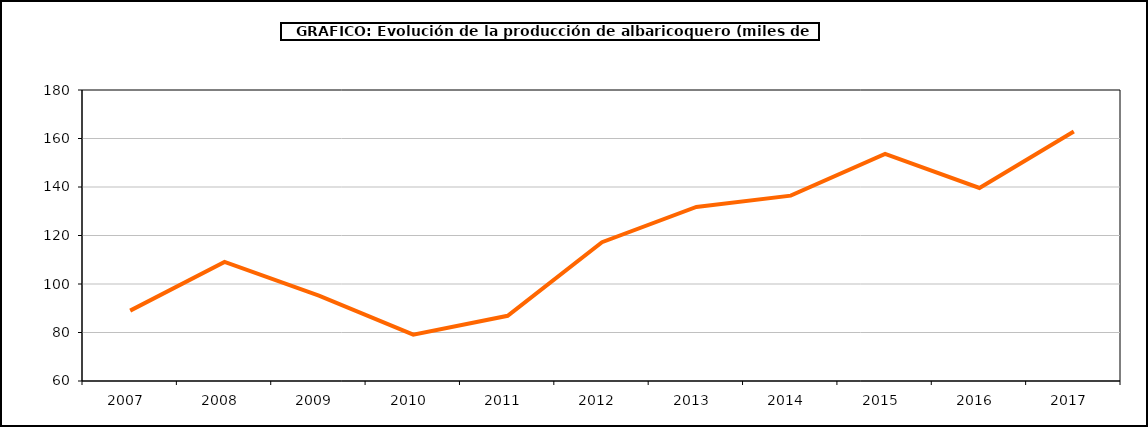
| Category | producción albaricoquero |
|---|---|
| 2007.0 | 89.023 |
| 2008.0 | 109.108 |
| 2009.0 | 95.221 |
| 2010.0 | 79.101 |
| 2011.0 | 86.88 |
| 2012.0 | 117.24 |
| 2013.0 | 131.776 |
| 2014.0 | 136.446 |
| 2015.0 | 153.667 |
| 2016.0 | 139.605 |
| 2017.0 | 162.872 |